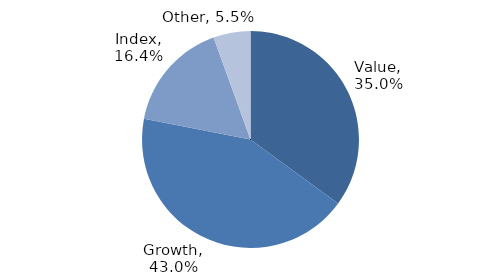
| Category | Investment Style |
|---|---|
| Value | 0.35 |
| Growth | 0.43 |
| Index | 0.164 |
| Other | 0.055 |